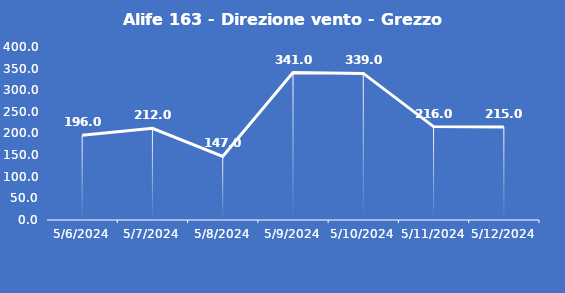
| Category | Alife 163 - Direzione vento - Grezzo (°N) |
|---|---|
| 5/6/24 | 196 |
| 5/7/24 | 212 |
| 5/8/24 | 147 |
| 5/9/24 | 341 |
| 5/10/24 | 339 |
| 5/11/24 | 216 |
| 5/12/24 | 215 |